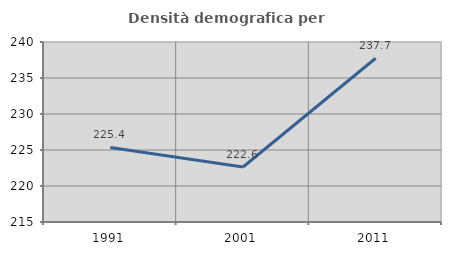
| Category | Densità demografica |
|---|---|
| 1991.0 | 225.35 |
| 2001.0 | 222.643 |
| 2011.0 | 237.742 |